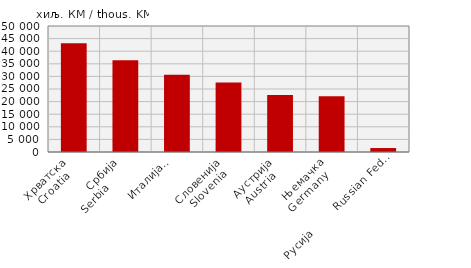
| Category | Извоз
Export |
|---|---|
| Хрватска
Croatia   | 43148 |
| Србија
Serbia        | 36414 |
| Италија
Italy   | 30624 |
| Словенија
Slovenia  | 27555 |
| Аустрија
Austria   | 22605 |
| Њемачка
Germany   | 22116 |
| Русија        Russian Federation | 1571 |